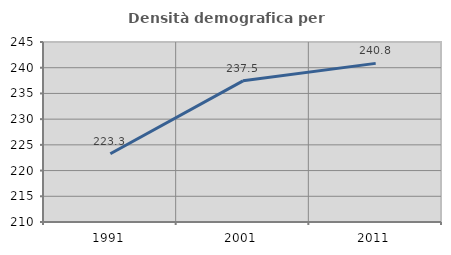
| Category | Densità demografica |
|---|---|
| 1991.0 | 223.264 |
| 2001.0 | 237.451 |
| 2011.0 | 240.844 |